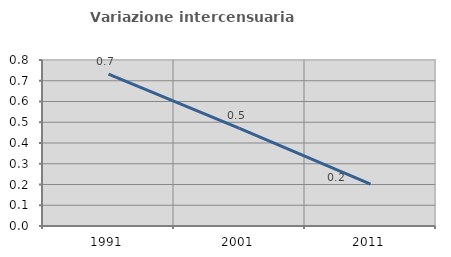
| Category | Variazione intercensuaria annua |
|---|---|
| 1991.0 | 0.731 |
| 2001.0 | 0.471 |
| 2011.0 | 0.202 |